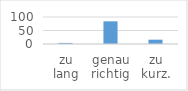
| Category | Series 0 |
|---|---|
| zu lang | 4 |
| genau richtig | 84 |
| zu kurz. | 16 |